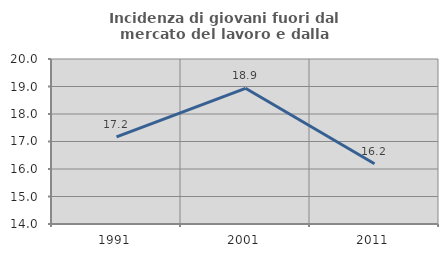
| Category | Incidenza di giovani fuori dal mercato del lavoro e dalla formazione  |
|---|---|
| 1991.0 | 17.169 |
| 2001.0 | 18.934 |
| 2011.0 | 16.188 |